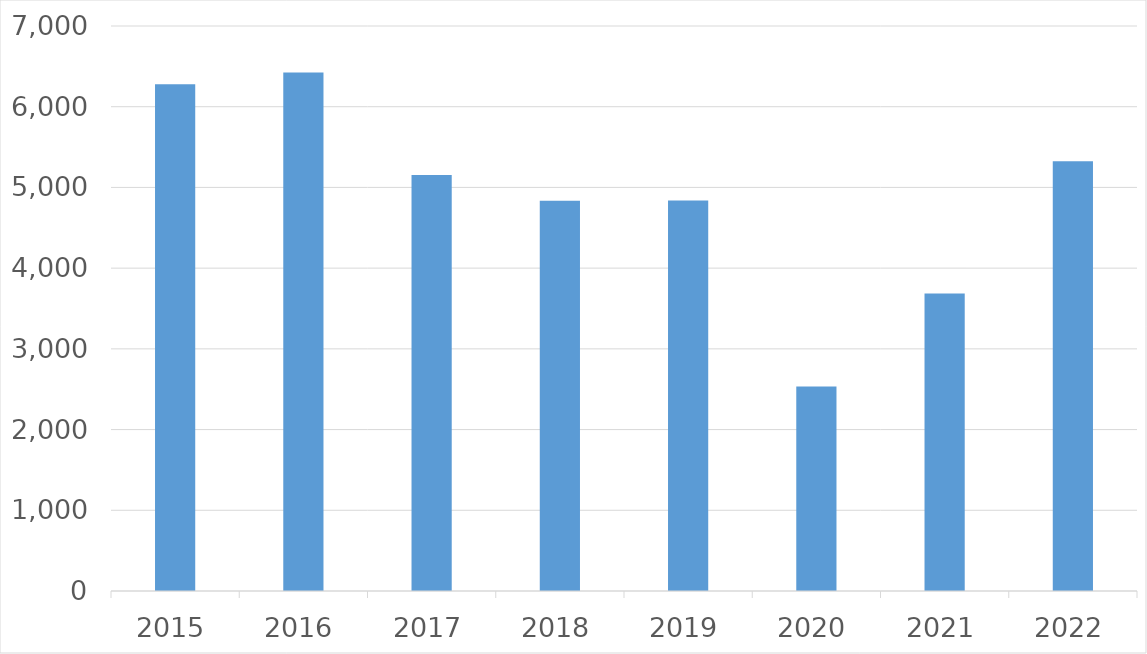
| Category | Series 0 |
|---|---|
| 2015 | 6279 |
| 2016 | 6425 |
| 2017 | 5155 |
| 2018 | 4834 |
| 2019 | 4838 |
| 2020 | 2533 |
| 2021 | 3685 |
| 2022 | 5323 |